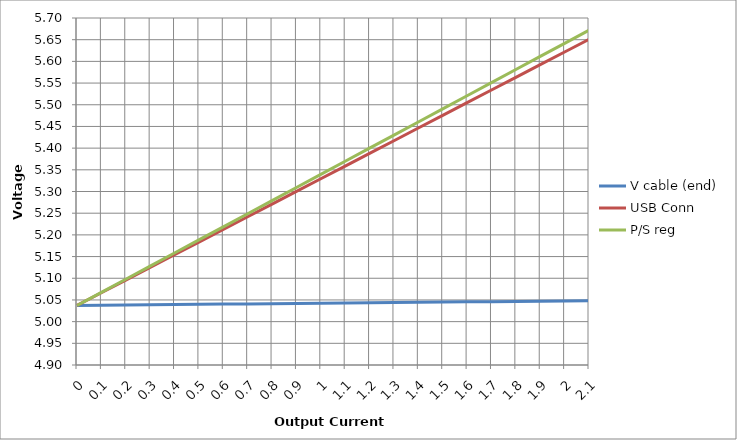
| Category | V cable (end) | USB Conn | P/S reg |
|---|---|---|---|
| 0.0 | 5.037 | 5.037 | 5.037 |
| 0.1 | 5.038 | 5.066 | 5.067 |
| 0.2 | 5.038 | 5.096 | 5.098 |
| 0.3 | 5.039 | 5.125 | 5.128 |
| 0.4 | 5.039 | 5.154 | 5.158 |
| 0.5 | 5.04 | 5.183 | 5.188 |
| 0.6 | 5.04 | 5.213 | 5.219 |
| 0.7 | 5.041 | 5.242 | 5.249 |
| 0.8 | 5.041 | 5.271 | 5.279 |
| 0.9 | 5.042 | 5.3 | 5.309 |
| 1.0 | 5.042 | 5.329 | 5.339 |
| 1.1 | 5.043 | 5.359 | 5.37 |
| 1.2 | 5.043 | 5.388 | 5.4 |
| 1.3 | 5.044 | 5.417 | 5.43 |
| 1.4 | 5.045 | 5.446 | 5.46 |
| 1.5 | 5.045 | 5.476 | 5.491 |
| 1.6 | 5.046 | 5.505 | 5.521 |
| 1.7 | 5.046 | 5.534 | 5.551 |
| 1.8 | 5.047 | 5.563 | 5.581 |
| 1.9 | 5.047 | 5.592 | 5.611 |
| 2.0 | 5.048 | 5.622 | 5.642 |
| 2.1 | 5.048 | 5.651 | 5.672 |